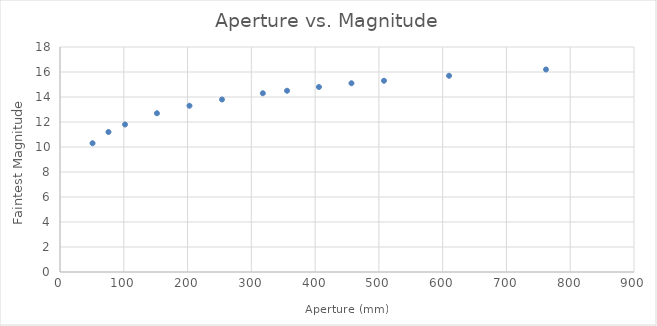
| Category | Series 0 |
|---|---|
| 51.0 | 10.3 |
| 76.0 | 11.2 |
| 102.0 | 11.8 |
| 152.0 | 12.7 |
| 203.0 | 13.3 |
| 254.0 | 13.8 |
| 318.0 | 14.3 |
| 356.0 | 14.5 |
| 406.0 | 14.8 |
| 457.0 | 15.1 |
| 508.0 | 15.3 |
| 610.0 | 15.7 |
| 762.0 | 16.2 |